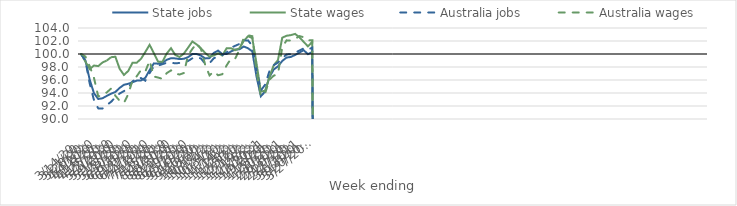
| Category | State jobs | State wages | Australia jobs | Australia wages |
|---|---|---|---|---|
| 14/03/2020 | 100 | 100 | 100 | 100 |
| 21/03/2020 | 99.013 | 98.821 | 98.97 | 99.607 |
| 28/03/2020 | 96.046 | 97.679 | 95.464 | 98.117 |
| 04/04/2020 | 93.972 | 98.228 | 92.906 | 96.324 |
| 11/04/2020 | 93.079 | 98.138 | 91.634 | 93.472 |
| 18/04/2020 | 93.191 | 98.698 | 91.618 | 93.672 |
| 25/04/2020 | 93.559 | 98.995 | 92.147 | 94.096 |
| 02/05/2020 | 93.892 | 99.511 | 92.646 | 94.684 |
| 09/05/2020 | 94.16 | 99.576 | 93.336 | 93.578 |
| 16/05/2020 | 94.784 | 97.723 | 93.928 | 92.809 |
| 23/05/2020 | 95.261 | 96.779 | 94.284 | 92.46 |
| 30/05/2020 | 95.416 | 97.381 | 94.792 | 93.812 |
| 06/06/2020 | 95.65 | 98.642 | 95.776 | 95.91 |
| 13/06/2020 | 95.905 | 98.657 | 96.277 | 96.583 |
| 20/06/2020 | 95.93 | 99.271 | 96.294 | 97.554 |
| 27/06/2020 | 96.341 | 100.307 | 95.892 | 97.289 |
| 04/07/2020 | 97.519 | 101.413 | 97.055 | 98.973 |
| 11/07/2020 | 98.556 | 100.1 | 98.106 | 96.533 |
| 18/07/2020 | 98.506 | 98.808 | 98.208 | 96.372 |
| 25/07/2020 | 98.651 | 98.811 | 98.434 | 96.181 |
| 01/08/2020 | 99.108 | 100.074 | 98.654 | 97.055 |
| 08/08/2020 | 99.351 | 100.891 | 98.656 | 97.48 |
| 15/08/2020 | 99.323 | 99.85 | 98.564 | 96.991 |
| 22/08/2020 | 99.223 | 99.54 | 98.619 | 96.84 |
| 29/08/2020 | 99.26 | 100.053 | 98.754 | 97.076 |
| 05/09/2020 | 99.516 | 100.981 | 98.928 | 99.803 |
| 12/09/2020 | 99.984 | 101.924 | 99.342 | 100.783 |
| 19/09/2020 | 99.995 | 101.468 | 99.517 | 101.637 |
| 26/09/2020 | 99.759 | 100.871 | 99.31 | 100.779 |
| 03/10/2020 | 99.321 | 100.148 | 98.488 | 98.325 |
| 10/10/2020 | 99.366 | 99.598 | 98.579 | 96.712 |
| 17/10/2020 | 100.167 | 99.779 | 99.343 | 97.299 |
| 24/10/2020 | 100.519 | 100.103 | 99.616 | 96.732 |
| 31/10/2020 | 99.984 | 99.77 | 99.832 | 96.893 |
| 07/11/2020 | 100.004 | 100.88 | 100.231 | 98.252 |
| 14/11/2020 | 100.378 | 100.896 | 100.956 | 99.261 |
| 21/11/2020 | 100.683 | 100.586 | 101.258 | 99.291 |
| 28/11/2020 | 100.722 | 100.886 | 101.546 | 100.638 |
| 05/12/2020 | 101.152 | 101.993 | 102.06 | 102.456 |
| 12/12/2020 | 100.884 | 102.731 | 102.096 | 102.885 |
| 19/12/2020 | 100.396 | 102.451 | 101.265 | 102.743 |
| 26/12/2020 | 96.494 | 98.497 | 97.433 | 97.212 |
| 02/01/2021 | 93.502 | 94.242 | 94.376 | 93.531 |
| 09/01/2021 | 94.223 | 94.329 | 95.285 | 93.978 |
| 16/01/2021 | 96.446 | 96.471 | 97.349 | 96.028 |
| 23/01/2021 | 97.606 | 98.266 | 98.277 | 96.664 |
| 30/01/2021 | 98.097 | 99.061 | 98.681 | 96.928 |
| 06/02/2021 | 98.93 | 102.508 | 99.348 | 101.023 |
| 13/02/2021 | 99.452 | 102.806 | 99.928 | 102.099 |
| 20/02/2021 | 99.545 | 102.904 | 99.969 | 102.073 |
| 27/02/2021 | 99.853 | 103.09 | 100.21 | 102.312 |
| 06/03/2021 | 100.207 | 102.58 | 100.53 | 102.759 |
| 13/03/2021 | 100.596 | 101.877 | 100.859 | 102.584 |
| 20/03/2021 | 99.967 | 101.179 | 100.674 | 102.081 |
| 27/03/2021 | 100.305 | 101.861 | 100.974 | 102.126 |